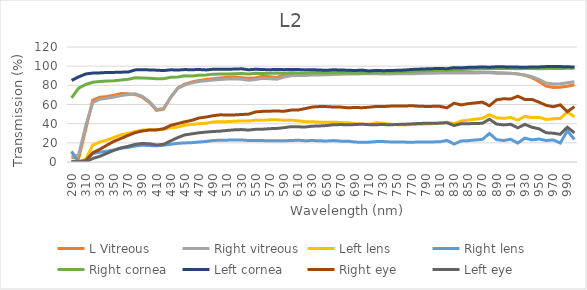
| Category | L Vitreous | Right vitreous | Left lens | Right lens | Right cornea | Left cornea | Right eye | Left eye |
|---|---|---|---|---|---|---|---|---|
| 290.0 | 4.765 | 5.187 | 11.361 | 10.691 | 66.942 | 85.173 | 0.574 | 0.574 |
| 300.0 | 3.844 | 7.702 | 0.345 | 0.324 | 77.055 | 88.777 | 0.053 | 0.059 |
| 310.0 | 34.253 | 37.662 | 3.044 | 1.784 | 80.928 | 91.854 | 1.327 | 0.277 |
| 320.0 | 64.595 | 61.887 | 17.664 | 8.874 | 83.176 | 92.811 | 9.601 | 3.655 |
| 330.0 | 67.686 | 65.509 | 20.831 | 10.325 | 83.946 | 92.982 | 13.326 | 5.963 |
| 340.0 | 68.438 | 66.558 | 22.814 | 11.228 | 84.606 | 93.433 | 17.567 | 9.076 |
| 350.0 | 69.807 | 67.827 | 25.657 | 12.572 | 84.859 | 93.498 | 21.627 | 12.249 |
| 360.0 | 71.351 | 69.263 | 28.399 | 14.375 | 85.507 | 93.756 | 24.621 | 14.798 |
| 370.0 | 71.252 | 70.486 | 29.799 | 15.191 | 86.397 | 93.886 | 27.765 | 16.391 |
| 380.0 | 70.307 | 71.089 | 31.849 | 16.688 | 87.922 | 96.117 | 30.683 | 18.378 |
| 390.0 | 67.608 | 68.438 | 33.297 | 17.531 | 87.761 | 96.294 | 32.322 | 19.351 |
| 400.0 | 62.116 | 63.023 | 33.667 | 17.128 | 87.337 | 96.073 | 33.404 | 18.958 |
| 410.0 | 53.963 | 54.916 | 33.69 | 16.924 | 86.956 | 95.83 | 33.497 | 17.762 |
| 420.0 | 55.22 | 55.911 | 34.261 | 17.498 | 86.836 | 95.411 | 34.658 | 18.399 |
| 430.0 | 67.577 | 67.562 | 35.703 | 18.467 | 88.45 | 96.206 | 38.221 | 22.05 |
| 440.0 | 77.304 | 76.825 | 36.425 | 19.467 | 88.777 | 95.94 | 40.077 | 25.533 |
| 450.0 | 81.227 | 80.445 | 38.459 | 19.911 | 90.012 | 96.427 | 41.966 | 28.301 |
| 460.0 | 83.58 | 82.661 | 39.228 | 20.207 | 89.867 | 96.294 | 43.521 | 29.383 |
| 470.0 | 85.075 | 83.965 | 39.976 | 20.84 | 90.636 | 96.516 | 45.941 | 30.493 |
| 480.0 | 86.139 | 84.84 | 40.486 | 21.454 | 90.761 | 96.073 | 46.946 | 31.239 |
| 490.0 | 86.956 | 85.566 | 41.783 | 22.408 | 91.685 | 96.761 | 48.306 | 31.805 |
| 500.0 | 87.74 | 86.099 | 42.092 | 22.751 | 91.833 | 96.805 | 49.215 | 32.218 |
| 510.0 | 88.328 | 86.596 | 42.131 | 22.798 | 91.706 | 96.65 | 49.068 | 32.984 |
| 520.0 | 88.654 | 86.896 | 42.501 | 23.057 | 92.045 | 97.006 | 49.136 | 33.558 |
| 530.0 | 88.044 | 86.278 | 42.894 | 22.967 | 92.406 | 97.23 | 49.568 | 33.822 |
| 540.0 | 87.297 | 85.349 | 42.737 | 22.413 | 91.876 | 96.25 | 49.969 | 33.327 |
| 550.0 | 87.963 | 86.04 | 43.712 | 22.408 | 92.619 | 96.783 | 52.252 | 34.119 |
| 560.0 | 89.392 | 87.378 | 43.511 | 22.32 | 92.363 | 96.427 | 52.857 | 34.245 |
| 570.0 | 89.064 | 86.936 | 44.025 | 22.192 | 92.491 | 96.316 | 53.064 | 34.762 |
| 580.0 | 88.288 | 86.278 | 44.005 | 22.09 | 92.832 | 96.583 | 53.174 | 35.059 |
| 590.0 | 90.803 | 88.675 | 43.581 | 22.192 | 92.64 | 96.361 | 52.942 | 35.793 |
| 600.0 | 92.109 | 89.991 | 43.702 | 22.418 | 93.046 | 96.605 | 54.138 | 36.906 |
| 610.0 | 92.47 | 90.448 | 42.964 | 22.725 | 92.747 | 96.494 | 54.275 | 36.703 |
| 620.0 | 92.47 | 90.344 | 42.092 | 22.187 | 92.512 | 96.095 | 55.783 | 36.543 |
| 630.0 | 92.854 | 90.782 | 42.111 | 22.403 | 93.068 | 96.339 | 57.372 | 37.368 |
| 640.0 | 92.897 | 90.887 | 41.572 | 22.121 | 93.068 | 95.962 | 57.836 | 37.61 |
| 650.0 | 93.132 | 91.096 | 41.362 | 21.938 | 93.132 | 95.697 | 57.796 | 38.045 |
| 660.0 | 93.368 | 91.285 | 41.591 | 22.367 | 93.197 | 96.25 | 57.372 | 38.878 |
| 670.0 | 93.498 | 91.559 | 41.162 | 21.762 | 93.261 | 95.984 | 57.266 | 39.048 |
| 680.0 | 93.627 | 91.706 | 40.851 | 21.707 | 93.068 | 95.786 | 56.585 | 38.86 |
| 690.0 | 93.799 | 91.876 | 40.105 | 20.845 | 92.961 | 95.455 | 56.859 | 39.03 |
| 700.0 | 93.886 | 92.151 | 39.61 | 20.469 | 92.854 | 95.896 | 56.676 | 39.482 |
| 710.0 | 93.951 | 92.066 | 39.255 | 20.711 | 92.897 | 95.017 | 57.122 | 38.931 |
| 720.0 | 93.864 | 92.024 | 40.87 | 21.267 | 93.411 | 95.609 | 57.97 | 38.967 |
| 730.0 | 93.691 | 91.939 | 40.458 | 21.311 | 93.347 | 95.28 | 57.85 | 39.066 |
| 740.0 | 93.584 | 91.854 | 39.418 | 20.912 | 93.584 | 95.477 | 58.304 | 38.824 |
| 750.0 | 93.627 | 91.96 | 38.931 | 20.874 | 93.843 | 95.697 | 58.385 | 39.192 |
| 760.0 | 93.735 | 92.045 | 38.672 | 20.763 | 94.124 | 95.94 | 58.385 | 39.437 |
| 770.0 | 93.778 | 92.193 | 39.066 | 20.587 | 94.602 | 96.561 | 58.749 | 39.783 |
| 780.0 | 93.929 | 92.363 | 39.319 | 20.869 | 94.864 | 96.872 | 58.224 | 40.17 |
| 790.0 | 94.037 | 92.619 | 39.61 | 20.965 | 95.148 | 97.163 | 57.983 | 40.448 |
| 800.0 | 94.254 | 92.726 | 40.05 | 20.98 | 95.411 | 97.409 | 58.05 | 40.467 |
| 810.0 | 94.297 | 92.939 | 40.57 | 21.047 | 95.697 | 97.634 | 58.103 | 40.588 |
| 820.0 | 94.254 | 92.982 | 41.553 | 22.553 | 95.786 | 97.32 | 56.507 | 40.935 |
| 830.0 | 93.929 | 92.811 | 39.912 | 18.724 | 96.405 | 98.492 | 61.39 | 38.072 |
| 840.0 | 93.735 | 92.854 | 42.678 | 21.963 | 96.538 | 98.197 | 59.58 | 39.958 |
| 850.0 | 93.627 | 92.832 | 43.631 | 22.289 | 96.895 | 98.742 | 60.828 | 39.994 |
| 860.0 | 93.67 | 92.875 | 44.658 | 22.972 | 97.208 | 98.946 | 61.688 | 40.151 |
| 870.0 | 93.648 | 93.004 | 45.52 | 23.583 | 97.387 | 99.129 | 62.474 | 40.383 |
| 880.0 | 93.541 | 93.046 | 49.34 | 29.737 | 97.589 | 98.924 | 58.681 | 44.668 |
| 890.0 | 93.175 | 92.662 | 46.004 | 23.356 | 97.521 | 99.357 | 64.878 | 39.573 |
| 900.0 | 92.875 | 92.512 | 45.53 | 22.423 | 97.544 | 99.289 | 65.963 | 38.672 |
| 910.0 | 92.534 | 92.3 | 46.409 | 23.73 | 97.589 | 99.106 | 65.72 | 39.346 |
| 920.0 | 91.96 | 91.812 | 43.732 | 19.747 | 97.364 | 99.015 | 68.659 | 35.645 |
| 930.0 | 90.448 | 90.866 | 47.577 | 24.923 | 97.477 | 98.901 | 65.253 | 39.264 |
| 940.0 | 88.105 | 89.146 | 46.366 | 23.041 | 97.454 | 99.083 | 65.343 | 36.233 |
| 950.0 | 84.101 | 86.218 | 46.612 | 23.999 | 97.409 | 99.22 | 62.402 | 34.626 |
| 960.0 | 79.104 | 82.414 | 44.351 | 22.413 | 97.521 | 99.563 | 59.17 | 30.507 |
| 970.0 | 77.857 | 81.508 | 45.009 | 23.041 | 97.544 | 99.563 | 57.637 | 30.047 |
| 980.0 | 77.983 | 81.583 | 45.467 | 19.788 | 97.477 | 99.563 | 59.621 | 28.887 |
| 990.0 | 79.068 | 82.623 | 52.264 | 32.599 | 97.926 | 99.334 | 52.493 | 36.258 |
| 1000.0 | 80.593 | 83.734 | 47.065 | 23.534 | 97.701 | 99.106 | 57.756 | 30.388 |